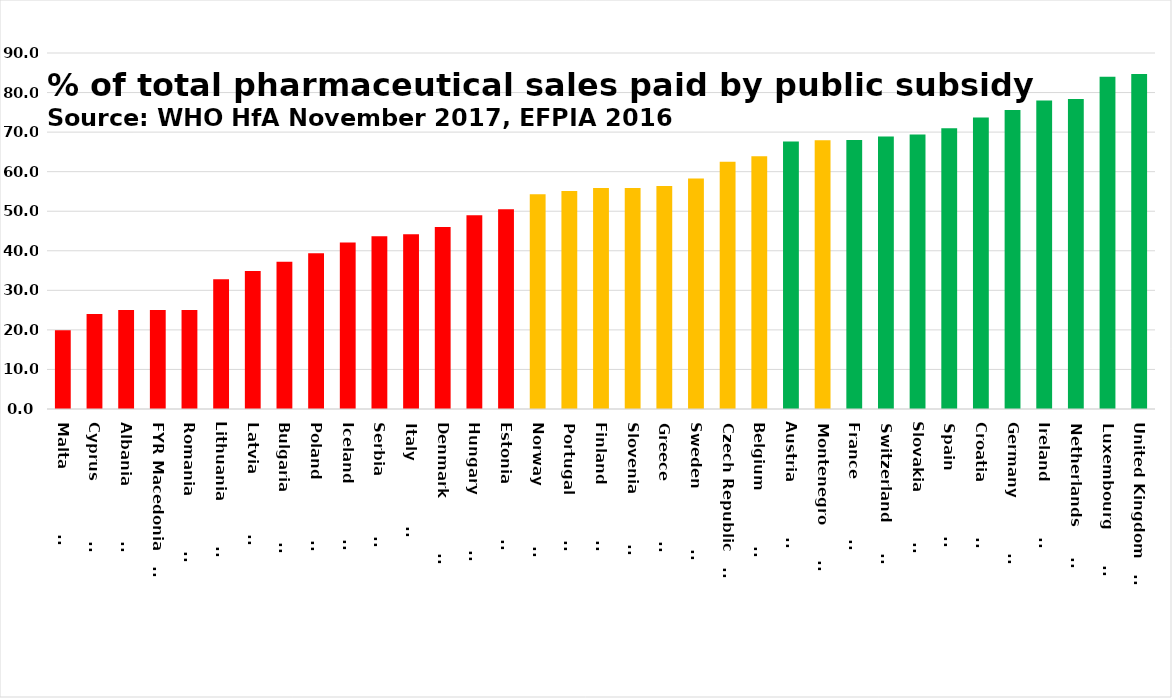
| Category | Series 0 |
|---|---|
| Malta                  | 19.93 |
| Cyprus                 | 24 |
| Albania                | 25 |
| FYR Macedonia         | 25 |
| Romania                | 25 |
| Lithuania              | 32.78 |
| Latvia                 | 34.9 |
| Bulgaria               | 37.2 |
| Poland                 | 39.4 |
| Iceland                | 42.1 |
| Serbia                 | 43.7 |
| Italy                  | 44.2 |
| Denmark                | 46 |
| Hungary                | 49 |
| Estonia                | 50.5 |
| Norway                 | 54.3 |
| Portugal               | 55.1 |
| Finland                | 55.9 |
| Slovenia               | 55.9 |
| Greece                 | 56.4 |
| Sweden                 | 58.3 |
| Czech Republic         | 62.5 |
| Belgium                | 63.9 |
| Austria                | 67.6 |
| Montenegro             | 67.92 |
| France                 | 68 |
| Switzerland            | 68.9 |
| Slovakia               | 69.4 |
| Spain                  | 71 |
| Croatia                | 73.7 |
| Germany                | 75.6 |
| Ireland                | 78 |
| Netherlands            | 78.4 |
| Luxembourg             | 84 |
| United Kingdom         | 84.7 |